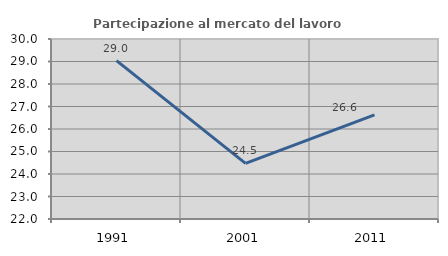
| Category | Partecipazione al mercato del lavoro  femminile |
|---|---|
| 1991.0 | 29.039 |
| 2001.0 | 24.476 |
| 2011.0 | 26.632 |